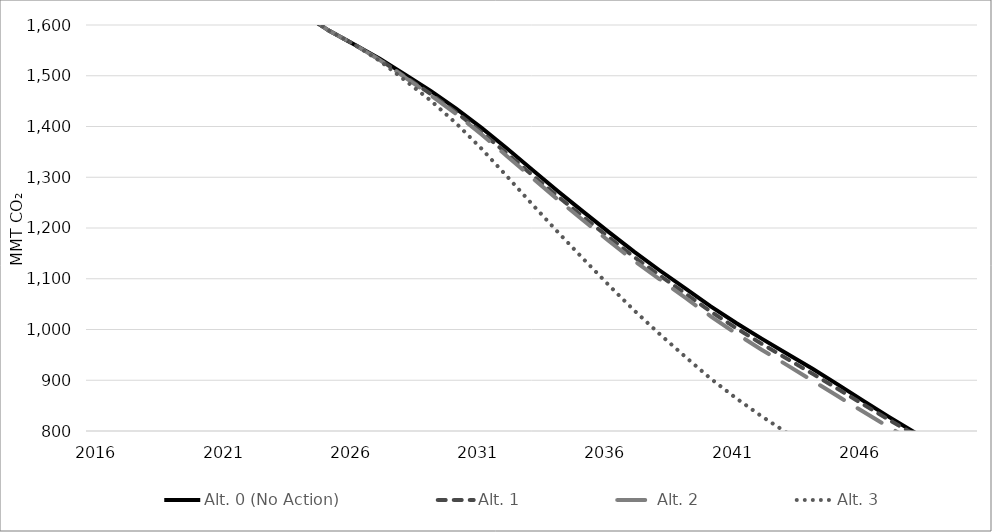
| Category | Alt. 0 (No Action) | Alt. 1 | Alt. 2 | Alt. 3 |
|---|---|---|---|---|
| 2016.0 | 1835.056 | 1835.056 | 1835.056 | 1835.056 |
| 2017.0 | 1806.467 | 1806.467 | 1806.467 | 1806.467 |
| 2018.0 | 1777.878 | 1777.878 | 1777.878 | 1777.878 |
| 2019.0 | 1749.289 | 1749.289 | 1749.289 | 1749.289 |
| 2020.0 | 1720.701 | 1720.701 | 1720.701 | 1720.701 |
| 2021.0 | 1692.112 | 1692.112 | 1692.112 | 1692.112 |
| 2022.0 | 1623.069 | 1623.069 | 1623.069 | 1623.069 |
| 2023.0 | 1635.871 | 1635.871 | 1635.871 | 1635.871 |
| 2024.0 | 1621.953 | 1621.953 | 1621.953 | 1621.953 |
| 2025.0 | 1588.984 | 1588.984 | 1588.984 | 1588.984 |
| 2026.0 | 1561.613 | 1561.613 | 1561.613 | 1561.613 |
| 2027.0 | 1533.691 | 1531.689 | 1531.04 | 1529.292 |
| 2028.0 | 1502.036 | 1497.995 | 1496.49 | 1490.697 |
| 2029.0 | 1470.243 | 1464.155 | 1461.787 | 1451.118 |
| 2030.0 | 1435.196 | 1427.873 | 1424.579 | 1406.307 |
| 2031.0 | 1397.193 | 1388.586 | 1384.42 | 1356.074 |
| 2032.0 | 1356.525 | 1346.615 | 1341.526 | 1301.697 |
| 2033.0 | 1314.161 | 1303.922 | 1298.26 | 1246.148 |
| 2034.0 | 1272.244 | 1262.004 | 1255.754 | 1191.687 |
| 2035.0 | 1231.684 | 1221.471 | 1214.703 | 1139.039 |
| 2036.0 | 1191.882 | 1181.508 | 1174.426 | 1087.216 |
| 2037.0 | 1152.893 | 1142.631 | 1135.245 | 1037.249 |
| 2038.0 | 1116.25 | 1106.347 | 1098.882 | 990.728 |
| 2039.0 | 1080.985 | 1071.171 | 1062.8 | 946.348 |
| 2040.0 | 1045.442 | 1035.298 | 1025.994 | 903.106 |
| 2041.0 | 1012.862 | 1002.746 | 992.067 | 864.579 |
| 2042.0 | 981.946 | 971.834 | 960.165 | 828.972 |
| 2043.0 | 952.232 | 942.336 | 929.841 | 796.291 |
| 2044.0 | 922.674 | 912.867 | 899.223 | 763.992 |
| 2045.0 | 891.394 | 882.69 | 868.372 | 733.32 |
| 2046.0 | 859.458 | 852.214 | 837.803 | 704.765 |
| 2047.0 | 827.841 | 822.083 | 807.55 | 677.25 |
| 2048.0 | 797.565 | 793.248 | 778.675 | 651.207 |
| 2049.0 | 765.882 | 762.824 | 748.373 | 625.638 |
| 2050.0 | 733.401 | 731.361 | 717.341 | 600.312 |